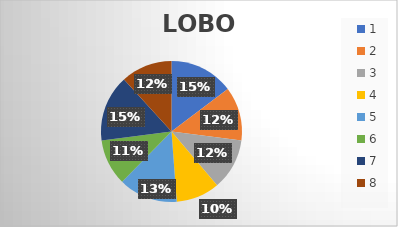
| Category | LOBO |
|---|---|
| 0 | 25 |
| 1 | 21 |
| 2 | 20 |
| 3 | 17 |
| 4 | 23 |
| 5 | 18 |
| 6 | 26 |
| 7 | 20 |